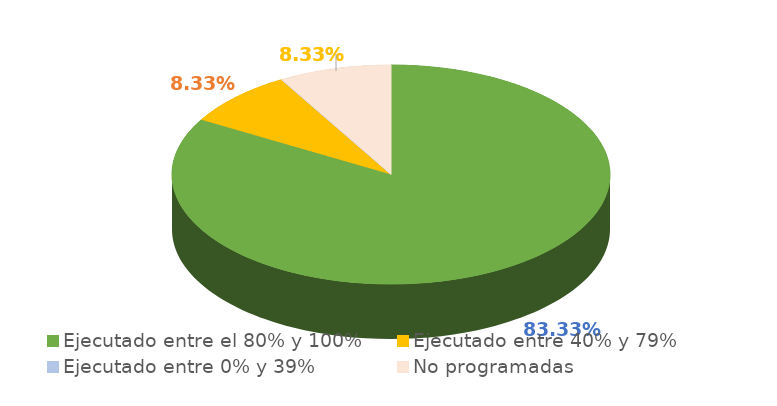
| Category | Series 0 |
|---|---|
| Ejecutado entre el 80% y 100% | 0.833 |
| Ejecutado entre 40% y 79% | 0.083 |
| Ejecutado entre 0% y 39% | 0 |
| No programadas | 0.083 |